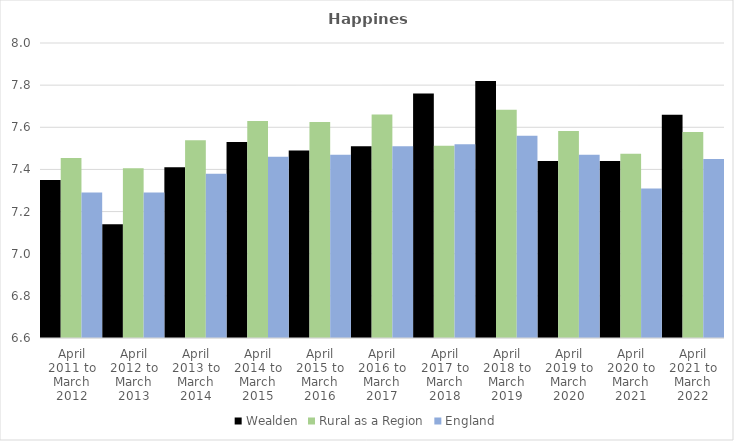
| Category | Wealden | Rural as a Region | England |
|---|---|---|---|
| April 2011 to March 2012 | 7.35 | 7.454 | 7.29 |
| April 2012 to March 2013 | 7.14 | 7.406 | 7.29 |
| April 2013 to March 2014 | 7.41 | 7.539 | 7.38 |
| April 2014 to March 2015 | 7.53 | 7.63 | 7.46 |
| April 2015 to March 2016 | 7.49 | 7.625 | 7.47 |
| April 2016 to March 2017 | 7.51 | 7.661 | 7.51 |
| April 2017 to March 2018 | 7.76 | 7.513 | 7.52 |
| April 2018 to March 2019 | 7.82 | 7.684 | 7.56 |
| April 2019 to March 2020 | 7.44 | 7.582 | 7.47 |
| April 2020 to March 2021 | 7.44 | 7.474 | 7.31 |
| April 2021 to March 2022 | 7.66 | 7.577 | 7.45 |